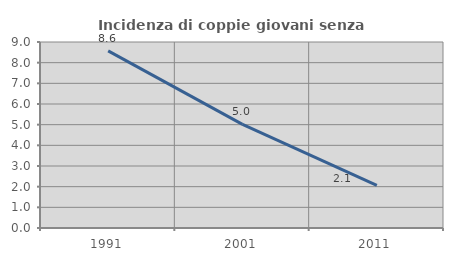
| Category | Incidenza di coppie giovani senza figli |
|---|---|
| 1991.0 | 8.571 |
| 2001.0 | 5.016 |
| 2011.0 | 2.059 |